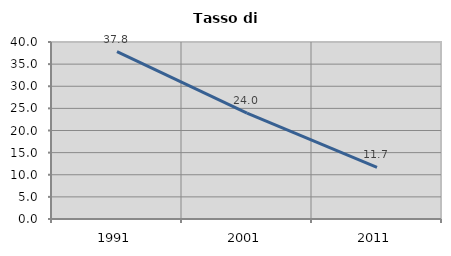
| Category | Tasso di disoccupazione   |
|---|---|
| 1991.0 | 37.83 |
| 2001.0 | 23.95 |
| 2011.0 | 11.675 |